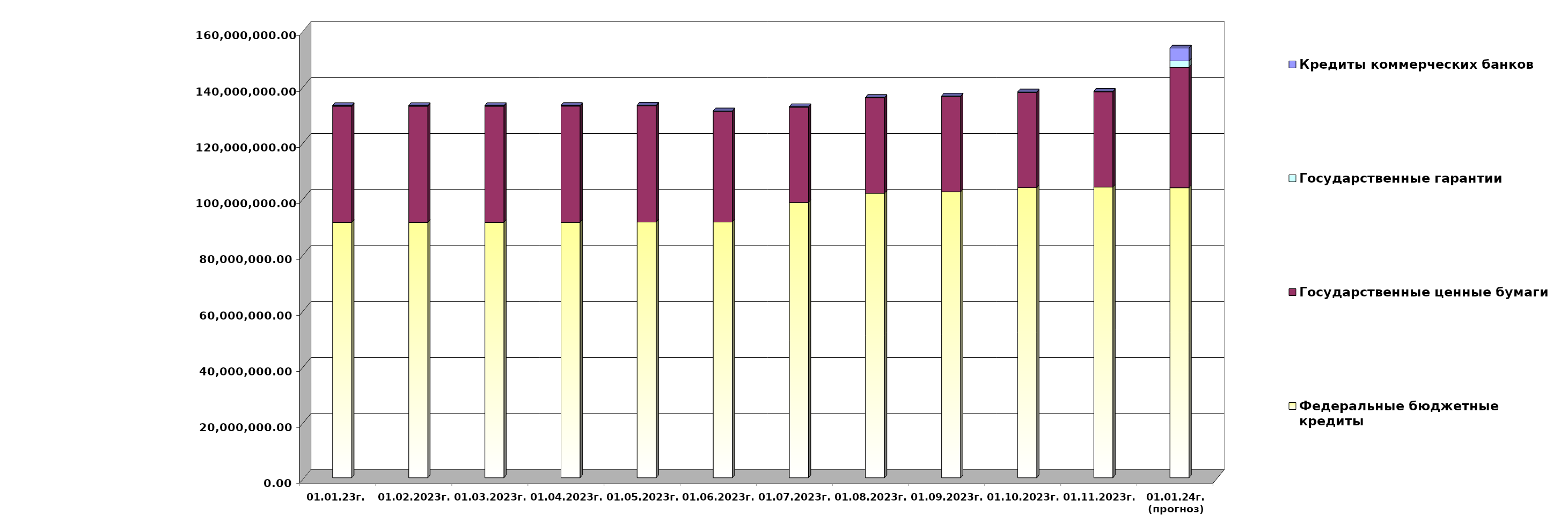
| Category | Федеральные бюджетные кредиты | Государственные ценные бумаги  | Государственные гарантии | Кредиты коммерческих банков |
|---|---|---|---|---|
| 01.01.23г. | 91228290.06 | 41500000 | 219957.743 | 0 |
| 01.02.2023г. | 91228290.06 | 41500000 | 217186.67 | 0 |
| 01.03.2023г. | 91228290.06 | 41500000 | 217186.67 | 0 |
| 01.04.2023г. | 91246617.843 | 41500000 | 218702.544 | 0 |
| 01.05.2023г. | 91334953.062 | 41500000 | 216632.858 | 0 |
| 01.06.2023г. | 91334953.062 | 39500000 | 201889.62 | 0 |
| 01.07.2023г. | 98352839.325 | 34000000 | 202402.323 | 0 |
| 01.08.2023г. | 101647637.335 | 34000000 | 198707.557 | 0 |
| 01.09.2023г. | 102154910.819 | 34000000 | 198971.052 | 0 |
| 01.10.2023г. | 103607689.942 | 34000000 | 199238.75 | 0 |
| 01.11.2023г. | 103839945.713 | 34000000 | 192112.881 | 0 |
| 01.01.24г.
(прогноз) | 103594267.9 | 43000000 | 2296427.8 | 4601422.3 |